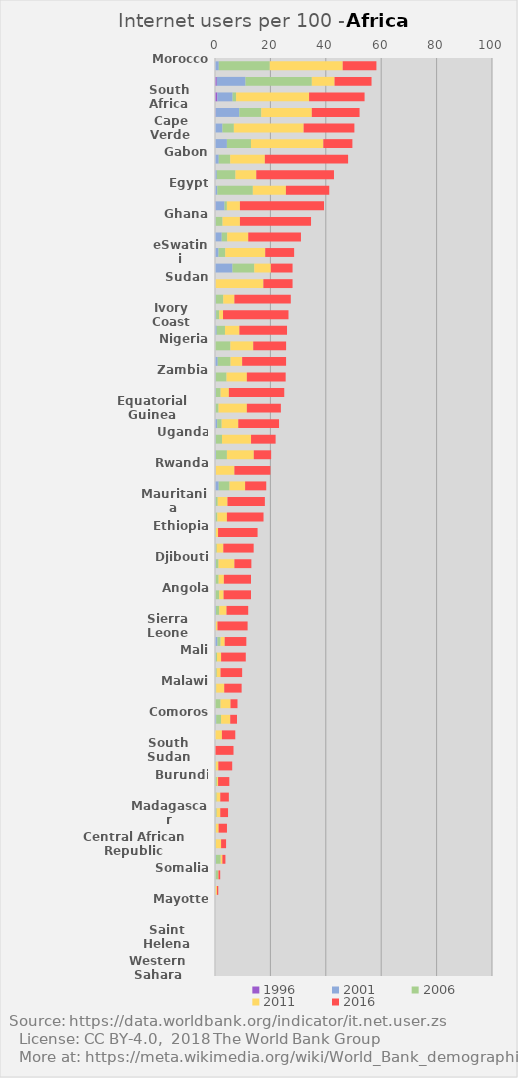
| Category | 1996 | 2001 | 2006 | 2011 | 2016 |
|---|---|---|---|---|---|
| Morocco | 0.01 | 1.36 | 18.4 | 26.34 | 12.16 |
| Seychelles | 0.65 | 10.37 | 23.93 | 8.21 | 13.35 |
| South Africa | 0.84 | 5.51 | 1.26 | 26.36 | 20.03 |
| Mauritius | 0.18 | 8.6 | 7.92 | 18.25 | 17.24 |
| Cape Verde | 0 | 2.69 | 4.12 | 25.19 | 18.32 |
| Tunisia | 0.03 | 4.27 | 8.69 | 26.11 | 10.5 |
| Gabon | 0 | 1.35 | 4.14 | 12.51 | 30.05 |
| Algeria | 0 | 0.65 | 6.73 | 7.52 | 28.05 |
| Egypt | 0.06 | 0.78 | 12.82 | 11.94 | 15.65 |
| Botswana | 0.16 | 3.27 | 0.86 | 4.71 | 30.36 |
| Ghana | 0.01 | 0.19 | 2.52 | 6.28 | 25.67 |
| Namibia | 0.01 | 2.41 | 1.98 | 7.6 | 19.03 |
| eSwatini | 0.05 | 1.23 | 2.42 | 14.43 | 10.44 |
| Sao Tome and Principe | 0 | 6.31 | 7.87 | 5.98 | 7.84 |
| Sudan | 0 | 0.14 | 0 | 17.32 | 10.54 |
| Lesotho | 0 | 0.26 | 2.72 | 4.02 | 20.36 |
| Ivory Coast | 0.01 | 0.39 | 1.12 | 1.38 | 23.63 |
| Kenya | 0.01 | 0.61 | 2.98 | 5.2 | 17.2 |
| Nigeria | 0.01 | 0.08 | 5.46 | 8.25 | 11.87 |
| Senegal | 0.01 | 0.97 | 4.63 | 4.19 | 15.86 |
| Zambia | 0.01 | 0.22 | 3.93 | 7.34 | 14.01 |
| Cameroon | 0 | 0.28 | 1.75 | 2.97 | 20 |
| Equatorial Guinea | 0 | 0.17 | 1.11 | 10.22 | 12.28 |
| Zimbabwe | 0.02 | 0.78 | 1.6 | 6 | 14.72 |
| Uganda | 0 | 0.24 | 2.29 | 10.48 | 8.87 |
| Libya | 0 | 0.37 | 3.93 | 9.7 | 6.27 |
| Rwanda | 0 | 0.24 | 0 | 6.76 | 13 |
| The Gambia | 0.04 | 1.3 | 3.9 | 5.63 | 7.63 |
| Mauritania | 0 | 0.26 | 0.72 | 3.52 | 13.5 |
| Mozambique | 0 | 0.16 | 0.68 | 3.46 | 13.22 |
| Ethiopia | 0 | 0.04 | 0.27 | 0.79 | 14.27 |
| Burkina Faso | 0 | 0.16 | 0.47 | 2.37 | 10.96 |
| Djibouti | 0.03 | 0.31 | 0.93 | 5.73 | 6.13 |
| Tanzania | 0 | 0.17 | 1.13 | 1.9 | 9.8 |
| Angola | 0 | 0.14 | 1.36 | 1.6 | 9.9 |
| Benin | 0 | 0.36 | 1.18 | 2.61 | 7.84 |
| Sierra Leone | 0 | 0.16 | 0.07 | 0.67 | 10.87 |
| Togo | 0.01 | 0.89 | 1.1 | 1.5 | 7.81 |
| Mali | 0 | 0.19 | 0.54 | 1.47 | 8.91 |
| Guinea | 0 | 0.18 | 0.46 | 1.36 | 7.8 |
| Malawi | 0 | 0.16 | 0.27 | 2.9 | 6.28 |
| Republic of the Congo | 0 | 0.03 | 1.98 | 3.59 | 2.52 |
| Comoros | 0 | 0.44 | 1.76 | 3.3 | 2.44 |
| Liberia | 0 | 0.03 | 0 | 2.47 | 4.82 |
| South Sudan | 0 | 0 | 0 | 0 | 6.68 |
| Democratic Republic of the Congo | 0 | 0.01 | 0.29 | 0.9 | 5.01 |
| Burundi | 0 | 0.11 | 0.55 | 0.45 | 4.06 |
| Chad | 0 | 0.05 | 0.53 | 1.32 | 3.1 |
| Madagascar | 0 | 0.22 | 0.39 | 1.29 | 2.81 |
| Niger | 0 | 0.11 | 0.18 | 1.01 | 3.02 |
| Central African Republic | 0.01 | 0.07 | 0.23 | 1.89 | 1.8 |
| Guinea-Bissau | 0 | 0.3 | 1.76 | 0.61 | 1.09 |
| Somalia | 0 | 0.08 | 1.02 | 0.15 | 0.63 |
| Eritrea | 0 | 0.16 | 0 | 0.54 | 0.48 |
| Mayotte | 0 | 0 | 0 | 0 | 0 |
| French Southern and Antarctic Lands | 0 | 0 | 0 | 0 | 0 |
| Saint Helena | 0 | 0 | 0 | 0 | 0 |
| Bouvet Island | 0 | 0 | 0 | 0 | 0 |
| Western Sahara | 0 | 0 | 0 | 0 | 0 |